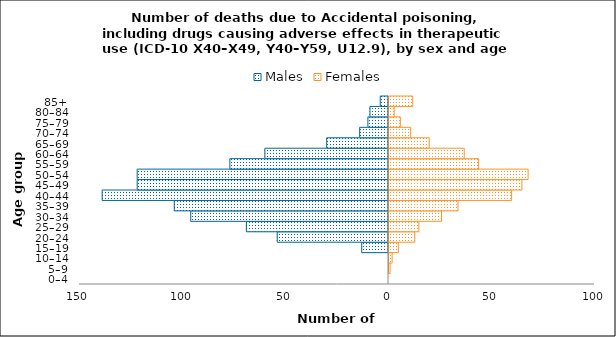
| Category | Males | Females |
|---|---|---|
| 0–4 | 0 | 0 |
| 5–9 | 0 | 1 |
| 10–14 | 0 | 2 |
| 15–19 | -13 | 5 |
| 20–24 | -54 | 13 |
| 25–29 | -69 | 15 |
| 30–34 | -96 | 26 |
| 35–39 | -104 | 34 |
| 40–44 | -139 | 60 |
| 45–49 | -122 | 65 |
| 50–54 | -122 | 68 |
| 55–59 | -77 | 44 |
| 60–64 | -60 | 37 |
| 65–69 | -30 | 20 |
| 70–74 | -14 | 11 |
| 75–79 | -10 | 6 |
| 80–84 | -9 | 3 |
| 85+ | -4 | 12 |